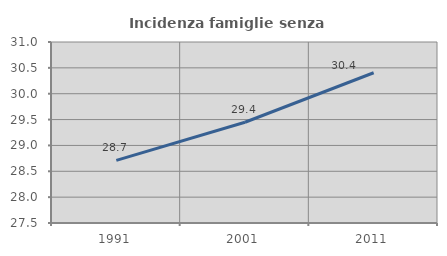
| Category | Incidenza famiglie senza nuclei |
|---|---|
| 1991.0 | 28.711 |
| 2001.0 | 29.449 |
| 2011.0 | 30.405 |